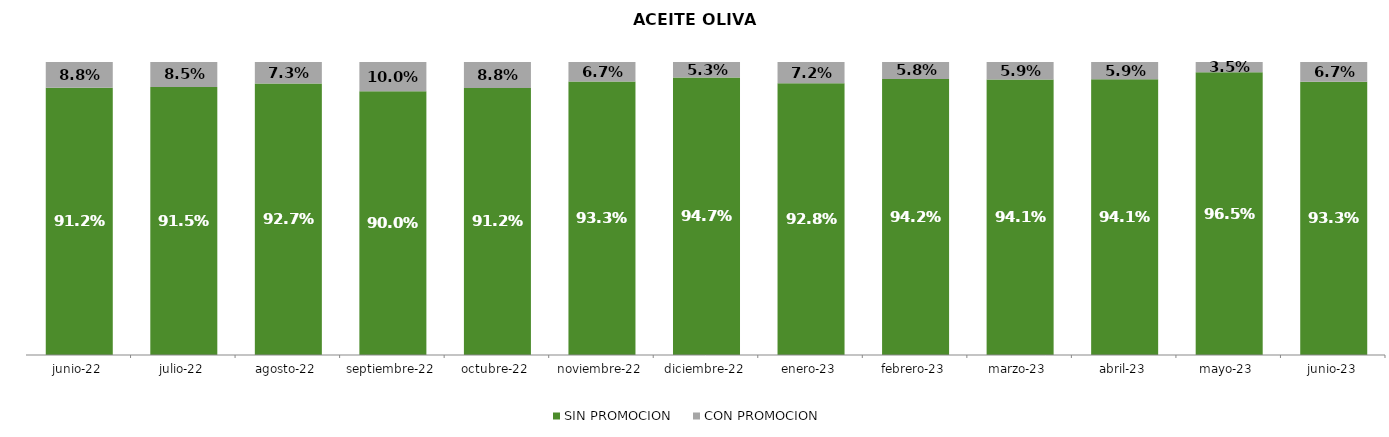
| Category | SIN PROMOCION   | CON PROMOCION   |
|---|---|---|
| 2022-06-01 | 0.912 | 0.088 |
| 2022-07-01 | 0.915 | 0.085 |
| 2022-08-01 | 0.927 | 0.073 |
| 2022-09-01 | 0.9 | 0.1 |
| 2022-10-01 | 0.912 | 0.088 |
| 2022-11-01 | 0.933 | 0.067 |
| 2022-12-01 | 0.947 | 0.053 |
| 2023-01-01 | 0.928 | 0.072 |
| 2023-02-01 | 0.942 | 0.058 |
| 2023-03-01 | 0.941 | 0.059 |
| 2023-04-01 | 0.941 | 0.059 |
| 2023-05-01 | 0.965 | 0.035 |
| 2023-06-01 | 0.933 | 0.067 |